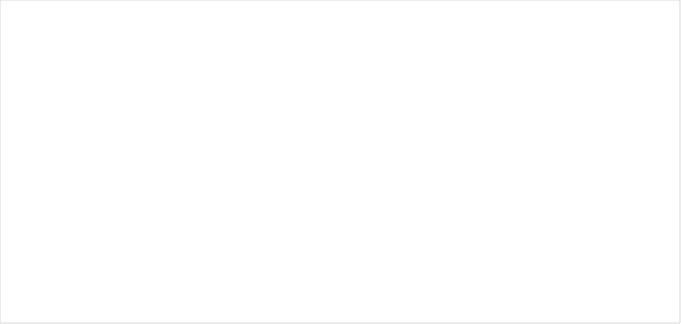
| Category | Average of 
Implied Return | Average of Alpha |
|---|---|---|
| High P/B | 0.015 | -0.019 |
| Low P/B | 0.012 | -0.024 |
| Medium P/B | 0.025 | -0.009 |